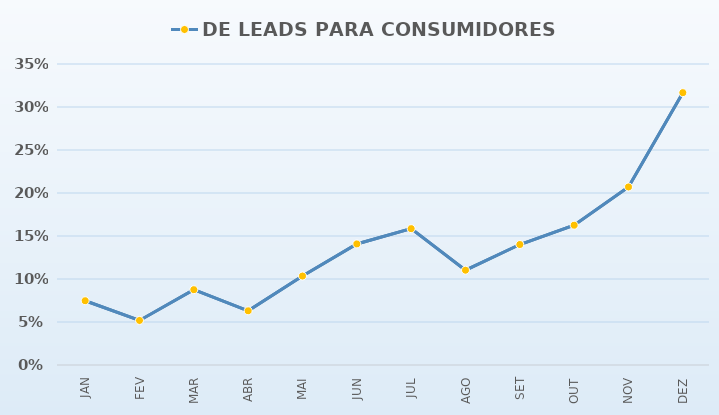
| Category | TAXA DE CONVERSÃO | DE LEADS PARA CONSUMIDORES % |
|---|---|---|
| JAN |  | 0.075 |
| FEV |  | 0.052 |
| MAR |  | 0.088 |
| ABR |  | 0.063 |
| MAI |  | 0.103 |
| JUN |  | 0.141 |
| JUL |  | 0.159 |
| AGO |  | 0.11 |
| SET |  | 0.14 |
| OUT |  | 0.163 |
| NOV |  | 0.207 |
| DEZ |  | 0.317 |